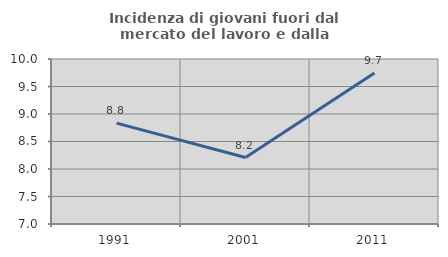
| Category | Incidenza di giovani fuori dal mercato del lavoro e dalla formazione  |
|---|---|
| 1991.0 | 8.834 |
| 2001.0 | 8.208 |
| 2011.0 | 9.744 |